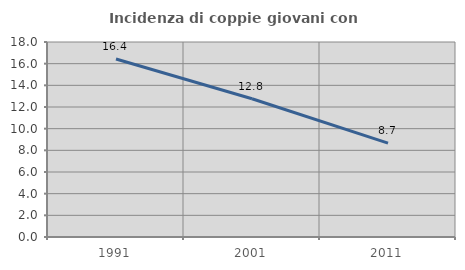
| Category | Incidenza di coppie giovani con figli |
|---|---|
| 1991.0 | 16.435 |
| 2001.0 | 12.766 |
| 2011.0 | 8.665 |